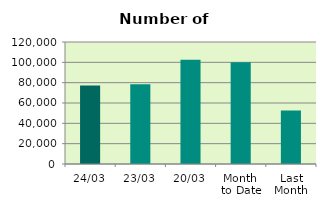
| Category | Series 0 |
|---|---|
| 24/03 | 77094 |
| 23/03 | 78408 |
| 20/03 | 102572 |
| Month 
to Date | 100034.824 |
| Last
Month | 52501.6 |